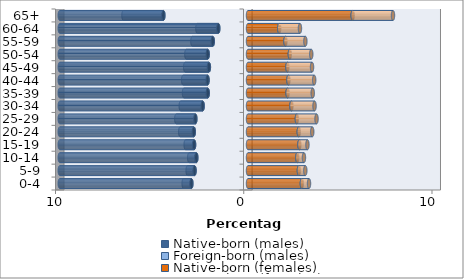
| Category | Native-born (males) | Foreign-born (males) | Native-born (females) | Foreign-born (females) |
|---|---|---|---|---|
| 0-4 | -3.008 | -0.411 | 2.861 | 0.38 |
| 5-9 | -2.839 | -0.368 | 2.703 | 0.342 |
| 10-14 | -2.745 | -0.378 | 2.618 | 0.354 |
| 15-19 | -2.864 | -0.448 | 2.73 | 0.428 |
| 20-24 | -2.88 | -0.723 | 2.697 | 0.716 |
| 25-29 | -2.796 | -1.014 | 2.596 | 1.044 |
| 30-34 | -2.41 | -1.164 | 2.308 | 1.226 |
| 35-39 | -2.139 | -1.261 | 2.103 | 1.336 |
| 40-44 | -2.149 | -1.296 | 2.148 | 1.369 |
| 45-49 | -2.078 | -1.259 | 2.094 | 1.308 |
| 50-54 | -2.142 | -1.134 | 2.223 | 1.138 |
| 55-59 | -1.872 | -1.082 | 1.989 | 1.059 |
| 60-64 | -1.579 | -1.111 | 1.658 | 1.102 |
| 65+ | -4.497 | -2.12 | 5.561 | 2.142 |